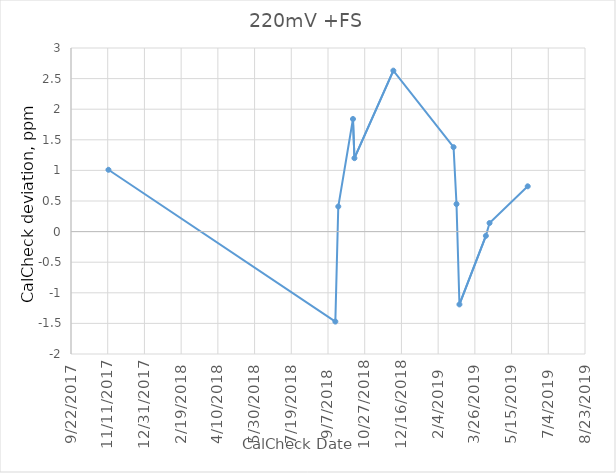
| Category | 220 mV +FS |
|---|---|
| 43051.0 | 1.01 |
| 43360.0 | -1.47 |
| 43364.0 | 0.41 |
| 43384.0 | 1.84 |
| 43386.0 | 1.2 |
| 43439.0 | 2.63 |
| 43521.0 | 1.38 |
| 43525.0 | 0.45 |
| 43529.0 | -1.19 |
| 43565.0 | -0.07 |
| 43570.0 | 0.14 |
| 43622.0 | 0.74 |